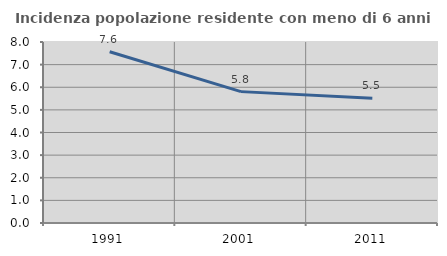
| Category | Incidenza popolazione residente con meno di 6 anni |
|---|---|
| 1991.0 | 7.566 |
| 2001.0 | 5.807 |
| 2011.0 | 5.515 |